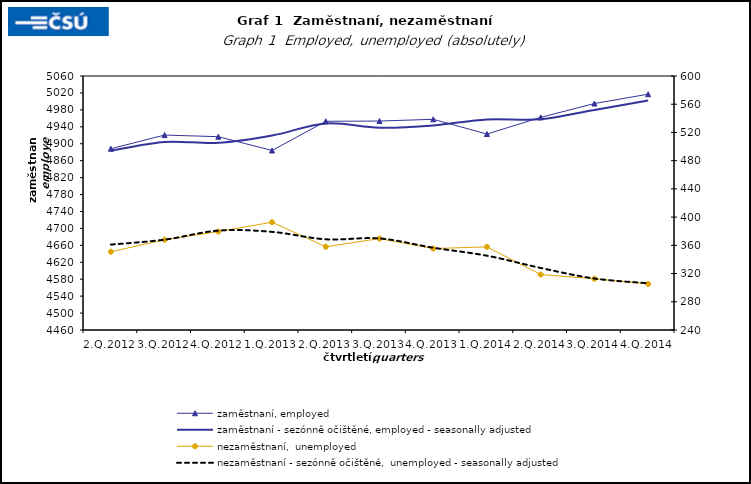
| Category | zaměstnaní, employed | zaměstnaní - sezónně očištěné, employed - seasonally adjusted |
|---|---|---|
| 2.Q.2012 | 4888.134 | 4883.737 |
| 3.Q.2012 | 4920.551 | 4904.283 |
| 4.Q.2012 | 4916.635 | 4902.091 |
| 1.Q.2013 | 4884.025 | 4919.294 |
| 2.Q.2013 | 4952.991 | 4948 |
| 3.Q.2013 | 4953.606 | 4937.926 |
| 4.Q.2013 | 4957.713 | 4943.325 |
| 1.Q.2014 | 4922.963 | 4957.43 |
| 2.Q.2014 | 4962.219 | 4957.847 |
| 3.Q.2014 | 4994.947 | 4979.826 |
| 4.Q.2014 | 5017.051 | 5002.187 |